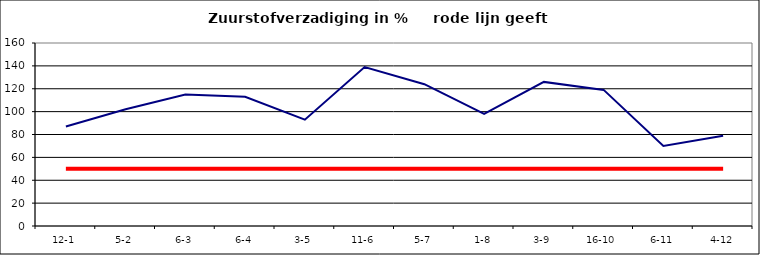
| Category | Series 0 | Series 1 |
|---|---|---|
| 12-1 | 87 | 50 |
| 5-2 | 102 | 50 |
| 6-3 | 115 | 50 |
| 6-4 | 113 | 50 |
| 3-5 | 93 | 50 |
| 11-6 | 139 | 50 |
| 5-7 | 124 | 50 |
| 1-8 | 98 | 50 |
| 3-9 | 126 | 50 |
| 16-10 | 119 | 50 |
| 6-11 | 70 | 50 |
| 4-12 | 79 | 50 |